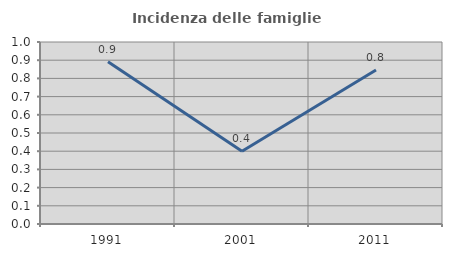
| Category | Incidenza delle famiglie numerose |
|---|---|
| 1991.0 | 0.891 |
| 2001.0 | 0.4 |
| 2011.0 | 0.846 |